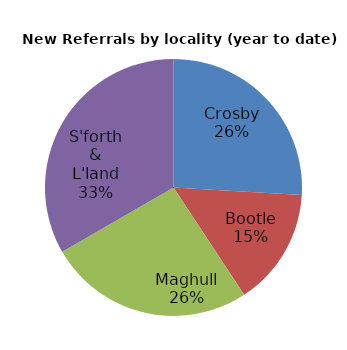
| Category | Series 0 |
|---|---|
| Crosby | 7 |
| Bootle | 4 |
| Maghull | 7 |
| S'forth & L'land | 9 |